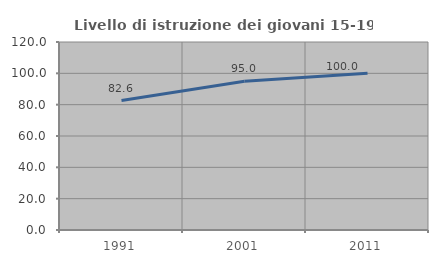
| Category | Livello di istruzione dei giovani 15-19 anni |
|---|---|
| 1991.0 | 82.609 |
| 2001.0 | 95 |
| 2011.0 | 100 |